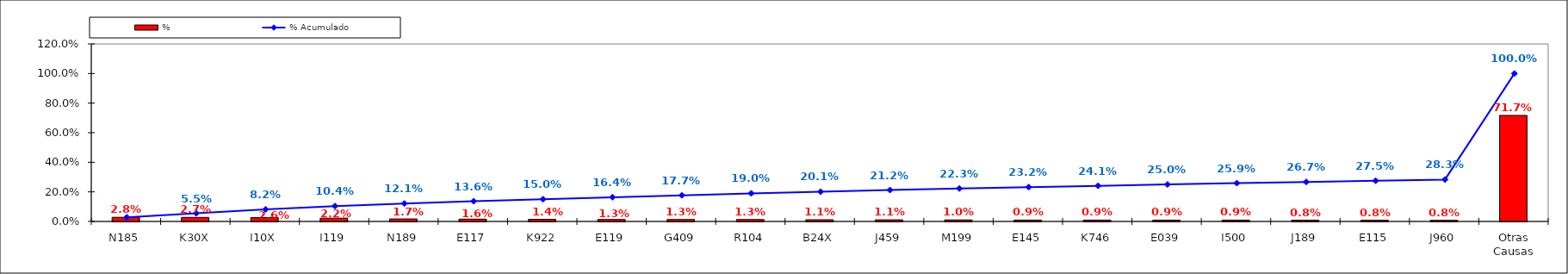
| Category | % |
|---|---|
| N185 | 0.028 |
| K30X | 0.027 |
| I10X | 0.026 |
| I119 | 0.022 |
| N189 | 0.017 |
| E117 | 0.016 |
| K922 | 0.014 |
| E119 | 0.013 |
| G409 | 0.013 |
| R104 | 0.013 |
| B24X | 0.011 |
| J459 | 0.011 |
| M199 | 0.01 |
| E145 | 0.009 |
| K746 | 0.009 |
| E039 | 0.009 |
| I500 | 0.009 |
| J189 | 0.008 |
| E115 | 0.008 |
| J960 | 0.008 |
| Otras Causas | 0.717 |